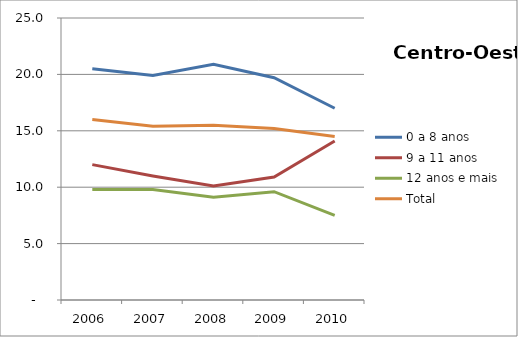
| Category | 0 a 8 anos | 9 a 11 anos | 12 anos e mais | Total |
|---|---|---|---|---|
| 2006.0 | 20.5 | 12 | 9.8 | 16 |
| 2007.0 | 19.9 | 11 | 9.8 | 15.4 |
| 2008.0 | 20.9 | 10.1 | 9.1 | 15.5 |
| 2009.0 | 19.7 | 10.9 | 9.6 | 15.2 |
| 2010.0 | 17 | 14.1 | 7.5 | 14.5 |